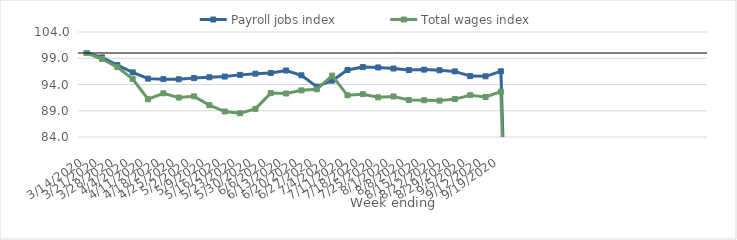
| Category | Payroll jobs index | Total wages index |
|---|---|---|
| 14/03/2020 | 100 | 100 |
| 21/03/2020 | 99.159 | 98.858 |
| 28/03/2020 | 97.708 | 97.314 |
| 04/04/2020 | 96.308 | 95.033 |
| 11/04/2020 | 95.118 | 91.196 |
| 18/04/2020 | 95.02 | 92.324 |
| 25/04/2020 | 94.996 | 91.508 |
| 02/05/2020 | 95.224 | 91.745 |
| 09/05/2020 | 95.376 | 90.055 |
| 16/05/2020 | 95.516 | 88.855 |
| 23/05/2020 | 95.834 | 88.524 |
| 30/05/2020 | 96.067 | 89.358 |
| 06/06/2020 | 96.197 | 92.364 |
| 13/06/2020 | 96.666 | 92.285 |
| 20/06/2020 | 95.746 | 92.884 |
| 27/06/2020 | 93.598 | 93.087 |
| 04/07/2020 | 94.732 | 95.696 |
| 11/07/2020 | 96.76 | 91.941 |
| 18/07/2020 | 97.314 | 92.153 |
| 25/07/2020 | 97.25 | 91.561 |
| 01/08/2020 | 97.039 | 91.726 |
| 08/08/2020 | 96.757 | 91.039 |
| 15/08/2020 | 96.835 | 91 |
| 22/08/2020 | 96.713 | 90.929 |
| 29/08/2020 | 96.496 | 91.219 |
| 05/09/2020 | 95.598 | 91.965 |
| 12/09/2020 | 95.559 | 91.613 |
| 19/09/2020 | 96.515 | 92.632 |